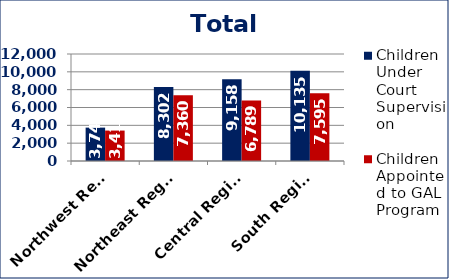
| Category | Children Under Court Supervision  | Children Appointed to GAL Program  |
|---|---|---|
| Northwest Region | 3744 | 3413 |
| Northeast Region | 8302 | 7360 |
| Central Region | 9158 | 6789 |
| South Region | 10135 | 7595 |